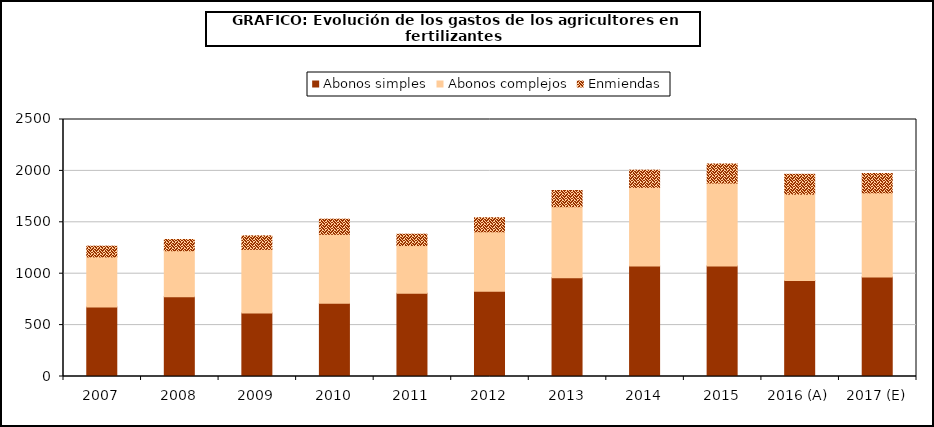
| Category | Abonos simples | Abonos complejos | Enmiendas |
|---|---|---|---|
| 2007 | 675.341 |  |  |
| 2008 | 776.533 |  |  |
| 2009 | 617.926 |  |  |
| 2010 | 711.864 |  |  |
| 2011 | 809.32 |  |  |
| 2012 | 828.171 |  |  |
| 2013 | 959.679 |  |  |
| 2014 | 1074.953 |  |  |
| 2015 | 1074.955 |  |  |
| 2016 (A) | 934.771 |  |  |
| 2017 (E) | 968.477 |  |  |